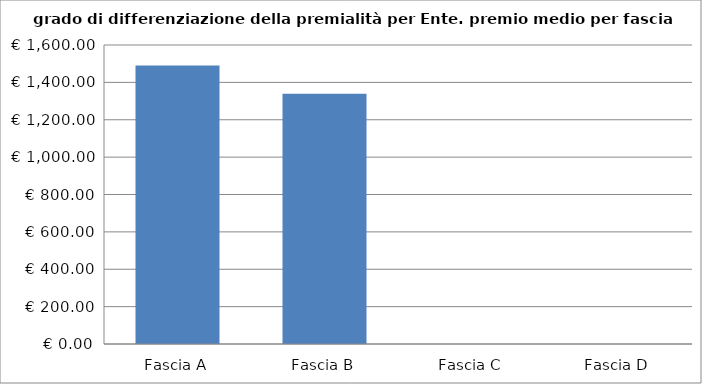
| Category | Totale ente |
|---|---|
| Fascia A | 1490.765 |
| Fascia B | 1339 |
| Fascia C | 0 |
| Fascia D | 0 |